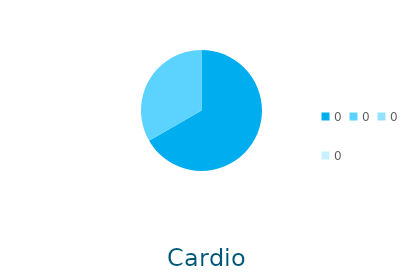
| Category | Series 0 |
|---|---|
| 0.0 | 2 |
| 0.0 | 1 |
| 0.0 | 0 |
| 0.0 | 0 |